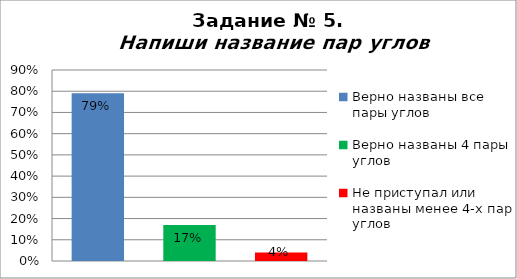
| Category | Напиши название пар углов |
|---|---|
| Верно названы все пары углов | 0.79 |
| Верно названы 4 пары углов | 0.17 |
| Не приступал или названы менее 4-х пар углов | 0.04 |